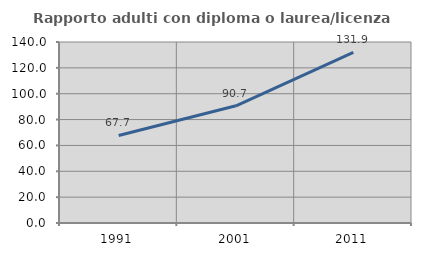
| Category | Rapporto adulti con diploma o laurea/licenza media  |
|---|---|
| 1991.0 | 67.74 |
| 2001.0 | 90.684 |
| 2011.0 | 131.887 |